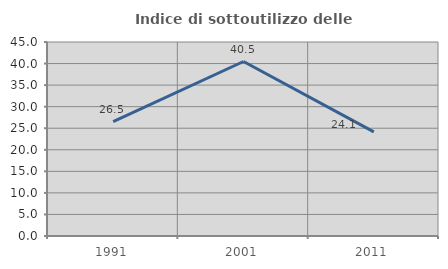
| Category | Indice di sottoutilizzo delle abitazioni  |
|---|---|
| 1991.0 | 26.506 |
| 2001.0 | 40.476 |
| 2011.0 | 24.138 |